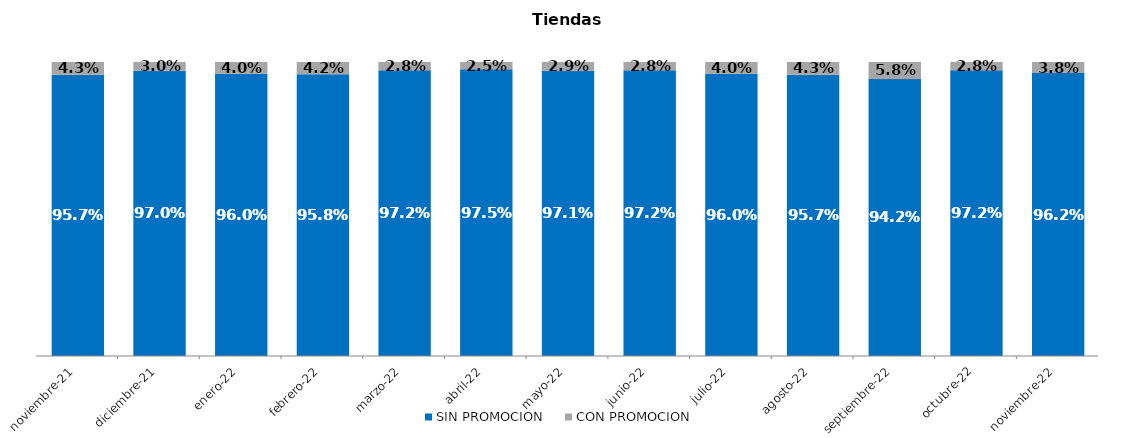
| Category | SIN PROMOCION   | CON PROMOCION   |
|---|---|---|
| 2021-11-01 | 0.957 | 0.043 |
| 2021-12-01 | 0.97 | 0.03 |
| 2022-01-01 | 0.96 | 0.04 |
| 2022-02-01 | 0.958 | 0.042 |
| 2022-03-01 | 0.972 | 0.028 |
| 2022-04-01 | 0.975 | 0.025 |
| 2022-05-01 | 0.971 | 0.029 |
| 2022-06-01 | 0.972 | 0.028 |
| 2022-07-01 | 0.96 | 0.04 |
| 2022-08-01 | 0.957 | 0.043 |
| 2022-09-01 | 0.942 | 0.058 |
| 2022-10-01 | 0.972 | 0.028 |
| 2022-11-01 | 0.962 | 0.038 |